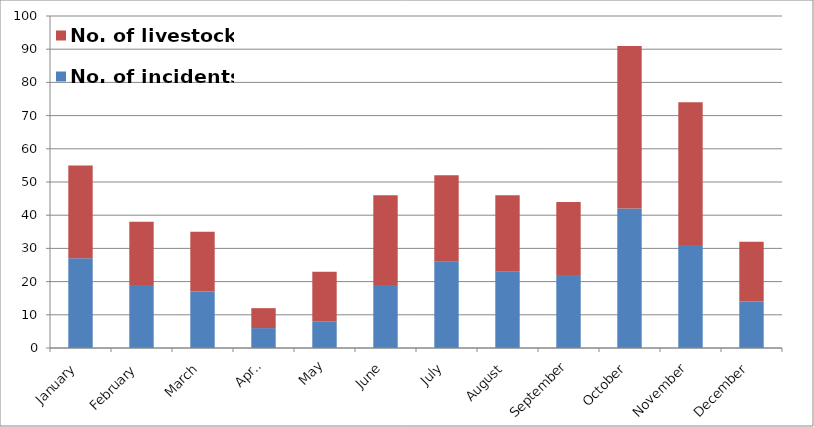
| Category | No. of incidents | No. of livestock |
|---|---|---|
| January | 27 | 28 |
| February | 19 | 19 |
| March | 17 | 18 |
| April | 6 | 6 |
| May | 8 | 15 |
| June | 19 | 27 |
| July | 26 | 26 |
| August | 23 | 23 |
| September | 22 | 22 |
| October | 42 | 49 |
| November | 31 | 43 |
| December | 14 | 18 |